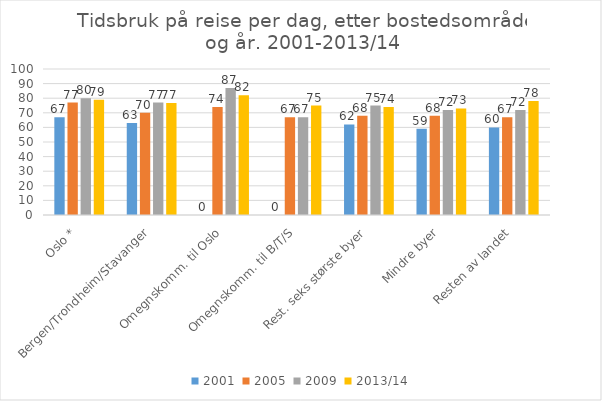
| Category | 2001 | 2005 | 2009 | 2013/14 |
|---|---|---|---|---|
| Oslo * | 67 | 77 | 80 | 79 |
| Bergen/Trondheim/Stavanger | 63 | 70 | 77 | 76.667 |
| Omegnskomm. til Oslo | 0 | 74 | 87 | 82 |
| Omegnskomm. til B/T/S | 0 | 67 | 67 | 75 |
| Rest. seks største byer | 62 | 68 | 75 | 74 |
| Mindre byer | 59 | 68 | 72 | 73 |
| Resten av landet | 60 | 67 | 72 | 78 |